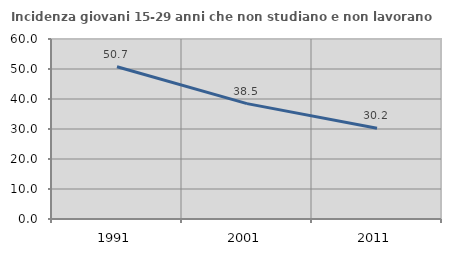
| Category | Incidenza giovani 15-29 anni che non studiano e non lavorano  |
|---|---|
| 1991.0 | 50.743 |
| 2001.0 | 38.462 |
| 2011.0 | 30.245 |